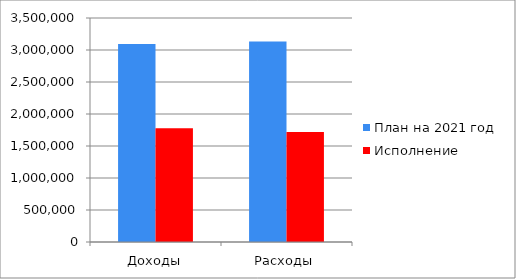
| Category | План на 2021 год | Исполнение |
|---|---|---|
| Доходы | 3093672.01 | 1777266.16 |
| Расходы | 3134499.33 | 1719321.94 |